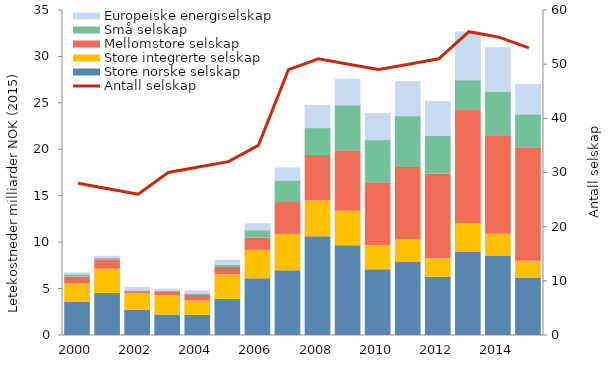
| Category | Store norske selskap | Store integrerte selskap | Mellomstore selskap | Små selskap | Europeiske energiselskap  |
|---|---|---|---|---|---|
| 2000.0 | 3.559 | 1.984 | 0.748 | 0.299 | 0.159 |
| 2001.0 | 4.519 | 2.619 | 1.018 | 0.221 | 0.165 |
| 2002.0 | 2.725 | 1.777 | 0.217 | 0.153 | 0.312 |
| 2003.0 | 2.215 | 2.058 | 0.363 | 0.211 | 0.15 |
| 2004.0 | 2.181 | 1.533 | 0.592 | 0.228 | 0.267 |
| 2005.0 | 3.888 | 2.631 | 0.814 | 0.301 | 0.466 |
| 2006.0 | 6.11 | 3.056 | 1.327 | 0.857 | 0.678 |
| 2007.0 | 6.974 | 3.91 | 3.433 | 2.38 | 1.352 |
| 2008.0 | 10.636 | 3.858 | 4.892 | 2.991 | 2.378 |
| 2009.0 | 9.678 | 3.701 | 6.525 | 4.897 | 2.817 |
| 2010.0 | 7.074 | 2.588 | 6.787 | 4.637 | 2.795 |
| 2011.0 | 7.85 | 2.44 | 7.816 | 5.549 | 3.677 |
| 2012.0 | 6.274 | 1.981 | 9.126 | 4.163 | 3.658 |
| 2013.0 | 8.936 | 3.1 | 12.269 | 3.207 | 5.178 |
| 2014.0 | 8.549 | 2.357 | 10.601 | 4.783 | 4.699 |
| 2015.0 | 6.195 | 1.797 | 12.154 | 3.682 | 3.201 |